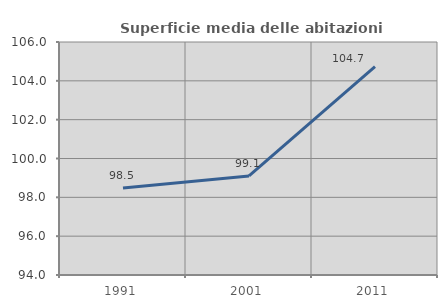
| Category | Superficie media delle abitazioni occupate |
|---|---|
| 1991.0 | 98.475 |
| 2001.0 | 99.102 |
| 2011.0 | 104.732 |